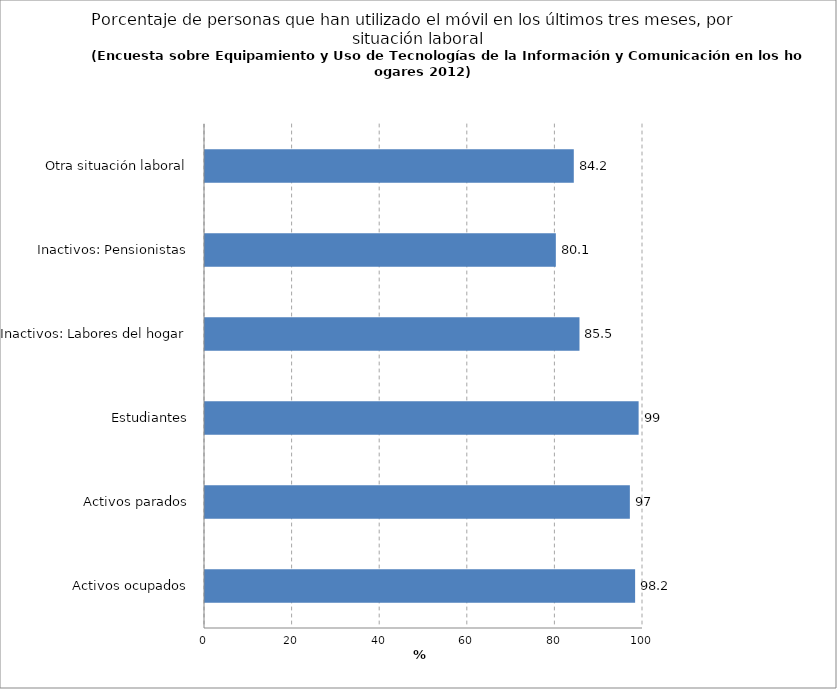
| Category | % |
|---|---|
| Activos ocupados | 98.2 |
| Activos parados | 97 |
|  Estudiantes | 99 |
| Inactivos: Labores del hogar | 85.5 |
|  Inactivos: Pensionistas | 80.1 |
|  Otra situación laboral | 84.2 |